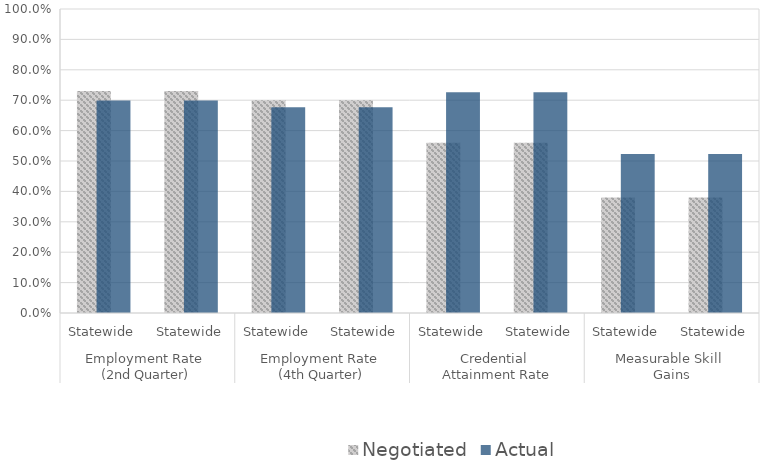
| Category | Negotiated | Actual |
|---|---|---|
| 0 | 0.73 | 0.699 |
| 1 | 0.73 | 0.699 |
| 2 | 0.7 | 0.677 |
| 3 | 0.7 | 0.677 |
| 4 | 0.56 | 0.726 |
| 5 | 0.56 | 0.726 |
| 6 | 0.38 | 0.523 |
| 7 | 0.38 | 0.523 |